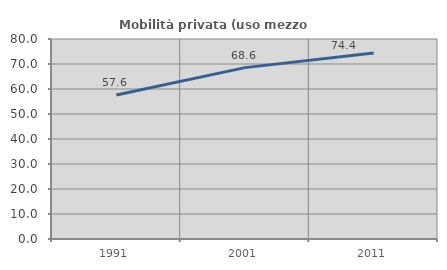
| Category | Mobilità privata (uso mezzo privato) |
|---|---|
| 1991.0 | 57.594 |
| 2001.0 | 68.551 |
| 2011.0 | 74.417 |